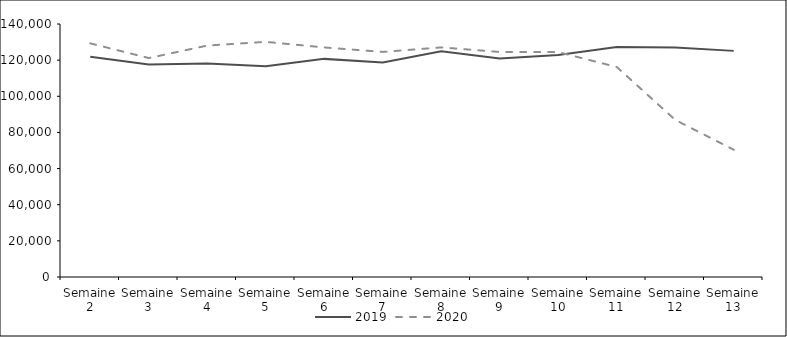
| Category | 2019 | 2020 |
|---|---|---|
| 0 | 121838 | 129293 |
| 1 | 117619 | 121149 |
| 2 | 118173 | 128065 |
| 3 | 116595 | 130119 |
| 4 | 120700 | 127035 |
| 5 | 118713 | 124550 |
| 6 | 124963 | 127059 |
| 7 | 120969 | 124523 |
| 8 | 122855 | 124434 |
| 9 | 127261 | 116216 |
| 10 | 127024 | 86939 |
| 11 | 125129 | 70400 |